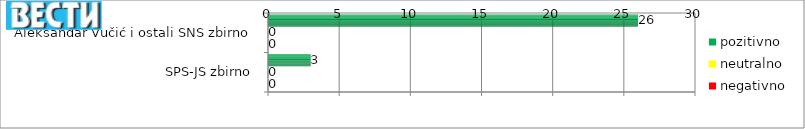
| Category | pozitivno | neutralno | negativno |
|---|---|---|---|
| Aleksandar Vučić i ostali SNS zbirno | 26 | 0 | 0 |
| SPS-JS zbirno | 3 | 0 | 0 |